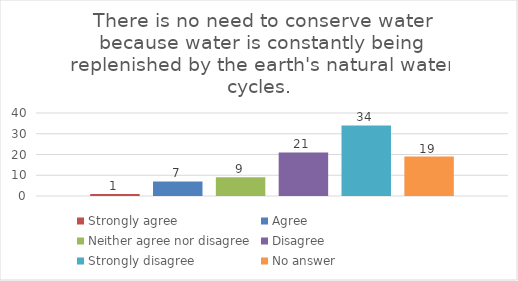
| Category | Strongly agree | Agree | Neither agree nor disagree | Disagree | Strongly disagree | No answer |
|---|---|---|---|---|---|---|
| 0 | 1 | 7 | 9 | 21 | 34 | 19 |